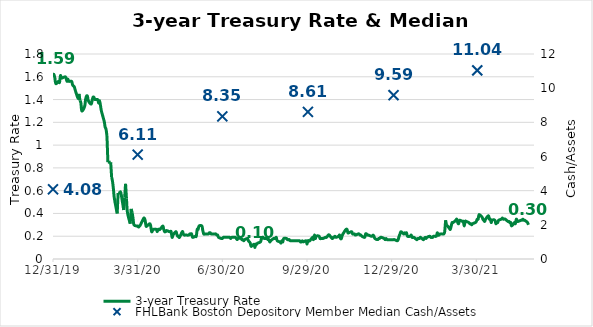
| Category | 3-year Treasury Rate |
|---|---|
| 43830.0 | 1.62 |
| 43831.0 | 1.62 |
| 43832.0 | 1.59 |
| 43833.0 | 1.54 |
| 43836.0 | 1.56 |
| 43837.0 | 1.55 |
| 43838.0 | 1.61 |
| 43839.0 | 1.59 |
| 43840.0 | 1.59 |
| 43843.0 | 1.6 |
| 43844.0 | 1.59 |
| 43845.0 | 1.56 |
| 43846.0 | 1.58 |
| 43847.0 | 1.56 |
| 43850.0 | 1.56 |
| 43851.0 | 1.53 |
| 43852.0 | 1.52 |
| 43853.0 | 1.51 |
| 43854.0 | 1.48 |
| 43857.0 | 1.41 |
| 43858.0 | 1.45 |
| 43859.0 | 1.39 |
| 43860.0 | 1.37 |
| 43861.0 | 1.3 |
| 43864.0 | 1.34 |
| 43865.0 | 1.4 |
| 43866.0 | 1.43 |
| 43867.0 | 1.43 |
| 43868.0 | 1.39 |
| 43871.0 | 1.36 |
| 43872.0 | 1.39 |
| 43873.0 | 1.42 |
| 43874.0 | 1.42 |
| 43875.0 | 1.4 |
| 43878.0 | 1.4 |
| 43879.0 | 1.37 |
| 43880.0 | 1.39 |
| 43881.0 | 1.35 |
| 43882.0 | 1.3 |
| 43885.0 | 1.21 |
| 43886.0 | 1.16 |
| 43887.0 | 1.14 |
| 43888.0 | 1.08 |
| 43889.0 | 0.85 |
| 43892.0 | 0.85 |
| 43893.0 | 0.72 |
| 43894.0 | 0.68 |
| 43895.0 | 0.61 |
| 43896.0 | 0.53 |
| 43899.0 | 0.4 |
| 43900.0 | 0.58 |
| 43901.0 | 0.58 |
| 43902.0 | 0.58 |
| 43903.0 | 0.58 |
| 43906.0 | 0.43 |
| 43907.0 | 0.54 |
| 43908.0 | 0.66 |
| 43909.0 | 0.53 |
| 43910.0 | 0.41 |
| 43913.0 | 0.31 |
| 43914.0 | 0.44 |
| 43915.0 | 0.41 |
| 43916.0 | 0.36 |
| 43917.0 | 0.3 |
| 43920.0 | 0.29 |
| 43921.0 | 0.29 |
| 43922.0 | 0.28 |
| 43923.0 | 0.29 |
| 43924.0 | 0.3 |
| 43927.0 | 0.35 |
| 43928.0 | 0.36 |
| 43929.0 | 0.34 |
| 43930.0 | 0.29 |
| 43931.0 | 0.29 |
| 43934.0 | 0.31 |
| 43935.0 | 0.29 |
| 43936.0 | 0.24 |
| 43937.0 | 0.25 |
| 43938.0 | 0.26 |
| 43941.0 | 0.26 |
| 43942.0 | 0.24 |
| 43943.0 | 0.26 |
| 43944.0 | 0.26 |
| 43945.0 | 0.26 |
| 43948.0 | 0.29 |
| 43949.0 | 0.26 |
| 43950.0 | 0.24 |
| 43951.0 | 0.24 |
| 43952.0 | 0.25 |
| 43955.0 | 0.24 |
| 43956.0 | 0.24 |
| 43957.0 | 0.24 |
| 43958.0 | 0.19 |
| 43959.0 | 0.21 |
| 43962.0 | 0.24 |
| 43963.0 | 0.22 |
| 43964.0 | 0.2 |
| 43965.0 | 0.2 |
| 43966.0 | 0.19 |
| 43969.0 | 0.24 |
| 43970.0 | 0.22 |
| 43971.0 | 0.21 |
| 43972.0 | 0.21 |
| 43973.0 | 0.21 |
| 43976.0 | 0.21 |
| 43977.0 | 0.22 |
| 43978.0 | 0.22 |
| 43979.0 | 0.22 |
| 43980.0 | 0.19 |
| 43983.0 | 0.2 |
| 43984.0 | 0.2 |
| 43985.0 | 0.26 |
| 43986.0 | 0.26 |
| 43987.0 | 0.29 |
| 43990.0 | 0.29 |
| 43991.0 | 0.25 |
| 43992.0 | 0.22 |
| 43993.0 | 0.22 |
| 43994.0 | 0.22 |
| 43997.0 | 0.22 |
| 43998.0 | 0.23 |
| 43999.0 | 0.23 |
| 44000.0 | 0.22 |
| 44001.0 | 0.22 |
| 44004.0 | 0.22 |
| 44005.0 | 0.22 |
| 44006.0 | 0.21 |
| 44007.0 | 0.21 |
| 44008.0 | 0.19 |
| 44011.0 | 0.18 |
| 44012.0 | 0.18 |
| 44013.0 | 0.19 |
| 44014.0 | 0.19 |
| 44015.0 | 0.19 |
| 44018.0 | 0.19 |
| 44019.0 | 0.19 |
| 44020.0 | 0.19 |
| 44021.0 | 0.18 |
| 44022.0 | 0.19 |
| 44025.0 | 0.19 |
| 44026.0 | 0.19 |
| 44027.0 | 0.18 |
| 44028.0 | 0.17 |
| 44029.0 | 0.18 |
| 44032.0 | 0.18 |
| 44033.0 | 0.17 |
| 44034.0 | 0.17 |
| 44035.0 | 0.16 |
| 44036.0 | 0.17 |
| 44039.0 | 0.18 |
| 44040.0 | 0.16 |
| 44041.0 | 0.15 |
| 44042.0 | 0.14 |
| 44043.0 | 0.11 |
| 44046.0 | 0.13 |
| 44047.0 | 0.1 |
| 44048.0 | 0.13 |
| 44049.0 | 0.13 |
| 44050.0 | 0.14 |
| 44053.0 | 0.15 |
| 44054.0 | 0.18 |
| 44055.0 | 0.19 |
| 44056.0 | 0.19 |
| 44057.0 | 0.18 |
| 44060.0 | 0.18 |
| 44061.0 | 0.17 |
| 44062.0 | 0.17 |
| 44063.0 | 0.15 |
| 44064.0 | 0.16 |
| 44067.0 | 0.18 |
| 44068.0 | 0.18 |
| 44069.0 | 0.18 |
| 44070.0 | 0.19 |
| 44071.0 | 0.16 |
| 44074.0 | 0.15 |
| 44075.0 | 0.14 |
| 44076.0 | 0.16 |
| 44077.0 | 0.15 |
| 44078.0 | 0.18 |
| 44081.0 | 0.18 |
| 44082.0 | 0.17 |
| 44083.0 | 0.17 |
| 44084.0 | 0.17 |
| 44085.0 | 0.16 |
| 44088.0 | 0.16 |
| 44089.0 | 0.16 |
| 44090.0 | 0.16 |
| 44091.0 | 0.16 |
| 44092.0 | 0.16 |
| 44095.0 | 0.16 |
| 44096.0 | 0.15 |
| 44097.0 | 0.15 |
| 44098.0 | 0.16 |
| 44099.0 | 0.15 |
| 44102.0 | 0.16 |
| 44103.0 | 0.13 |
| 44104.0 | 0.16 |
| 44105.0 | 0.16 |
| 44106.0 | 0.16 |
| 44109.0 | 0.19 |
| 44110.0 | 0.17 |
| 44111.0 | 0.21 |
| 44112.0 | 0.18 |
| 44113.0 | 0.2 |
| 44116.0 | 0.2 |
| 44117.0 | 0.18 |
| 44118.0 | 0.18 |
| 44119.0 | 0.18 |
| 44120.0 | 0.18 |
| 44123.0 | 0.19 |
| 44124.0 | 0.19 |
| 44125.0 | 0.2 |
| 44126.0 | 0.21 |
| 44127.0 | 0.21 |
| 44130.0 | 0.18 |
| 44131.0 | 0.19 |
| 44132.0 | 0.19 |
| 44133.0 | 0.2 |
| 44134.0 | 0.19 |
| 44137.0 | 0.2 |
| 44138.0 | 0.21 |
| 44139.0 | 0.18 |
| 44140.0 | 0.18 |
| 44141.0 | 0.21 |
| 44144.0 | 0.25 |
| 44145.0 | 0.26 |
| 44146.0 | 0.26 |
| 44147.0 | 0.23 |
| 44148.0 | 0.23 |
| 44151.0 | 0.24 |
| 44152.0 | 0.22 |
| 44153.0 | 0.22 |
| 44154.0 | 0.22 |
| 44155.0 | 0.21 |
| 44158.0 | 0.22 |
| 44159.0 | 0.22 |
| 44160.0 | 0.21 |
| 44161.0 | 0.21 |
| 44162.0 | 0.2 |
| 44165.0 | 0.19 |
| 44166.0 | 0.22 |
| 44167.0 | 0.22 |
| 44168.0 | 0.21 |
| 44169.0 | 0.21 |
| 44172.0 | 0.2 |
| 44173.0 | 0.2 |
| 44174.0 | 0.21 |
| 44175.0 | 0.2 |
| 44176.0 | 0.18 |
| 44179.0 | 0.17 |
| 44180.0 | 0.18 |
| 44181.0 | 0.18 |
| 44182.0 | 0.19 |
| 44183.0 | 0.19 |
| 44186.0 | 0.18 |
| 44187.0 | 0.17 |
| 44188.0 | 0.18 |
| 44189.0 | 0.17 |
| 44190.0 | 0.17 |
| 44193.0 | 0.17 |
| 44194.0 | 0.17 |
| 44195.0 | 0.17 |
| 44196.0 | 0.17 |
| 44197.0 | 0.17 |
| 44200.0 | 0.16 |
| 44201.0 | 0.17 |
| 44202.0 | 0.2 |
| 44203.0 | 0.22 |
| 44204.0 | 0.24 |
| 44207.0 | 0.22 |
| 44208.0 | 0.23 |
| 44209.0 | 0.22 |
| 44210.0 | 0.23 |
| 44211.0 | 0.2 |
| 44214.0 | 0.2 |
| 44215.0 | 0.21 |
| 44216.0 | 0.19 |
| 44217.0 | 0.19 |
| 44218.0 | 0.19 |
| 44221.0 | 0.17 |
| 44222.0 | 0.18 |
| 44223.0 | 0.18 |
| 44224.0 | 0.18 |
| 44225.0 | 0.19 |
| 44228.0 | 0.17 |
| 44229.0 | 0.18 |
| 44230.0 | 0.19 |
| 44231.0 | 0.18 |
| 44232.0 | 0.19 |
| 44235.0 | 0.2 |
| 44236.0 | 0.19 |
| 44237.0 | 0.19 |
| 44238.0 | 0.19 |
| 44239.0 | 0.2 |
| 44242.0 | 0.2 |
| 44243.0 | 0.23 |
| 44244.0 | 0.21 |
| 44245.0 | 0.21 |
| 44246.0 | 0.22 |
| 44249.0 | 0.22 |
| 44250.0 | 0.22 |
| 44251.0 | 0.24 |
| 44252.0 | 0.34 |
| 44253.0 | 0.3 |
| 44256.0 | 0.27 |
| 44257.0 | 0.26 |
| 44258.0 | 0.29 |
| 44259.0 | 0.32 |
| 44260.0 | 0.32 |
| 44263.0 | 0.34 |
| 44264.0 | 0.35 |
| 44265.0 | 0.32 |
| 44266.0 | 0.31 |
| 44267.0 | 0.34 |
| 44270.0 | 0.33 |
| 44271.0 | 0.33 |
| 44272.0 | 0.29 |
| 44273.0 | 0.33 |
| 44274.0 | 0.33 |
| 44277.0 | 0.32 |
| 44278.0 | 0.31 |
| 44279.0 | 0.31 |
| 44280.0 | 0.3 |
| 44281.0 | 0.31 |
| 44284.0 | 0.32 |
| 44285.0 | 0.33 |
| 44286.0 | 0.35 |
| 44287.0 | 0.35 |
| 44288.0 | 0.39 |
| 44291.0 | 0.37 |
| 44292.0 | 0.35 |
| 44293.0 | 0.34 |
| 44294.0 | 0.33 |
| 44295.0 | 0.35 |
| 44298.0 | 0.38 |
| 44299.0 | 0.35 |
| 44300.0 | 0.35 |
| 44301.0 | 0.32 |
| 44302.0 | 0.34 |
| 44305.0 | 0.34 |
| 44306.0 | 0.31 |
| 44307.0 | 0.32 |
| 44308.0 | 0.32 |
| 44309.0 | 0.34 |
| 44312.0 | 0.35 |
| 44313.0 | 0.36 |
| 44314.0 | 0.35 |
| 44315.0 | 0.35 |
| 44316.0 | 0.35 |
| 44319.0 | 0.33 |
| 44320.0 | 0.33 |
| 44321.0 | 0.32 |
| 44322.0 | 0.32 |
| 44323.0 | 0.29 |
| 44326.0 | 0.32 |
| 44327.0 | 0.31 |
| 44328.0 | 0.35 |
| 44329.0 | 0.33 |
| 44330.0 | 0.33 |
| 44333.0 | 0.34 |
| 44334.0 | 0.34 |
| 44335.0 | 0.35 |
| 44336.0 | 0.34 |
| 44337.0 | 0.34 |
| 44340.0 | 0.32 |
| 44341.0 | 0.3 |